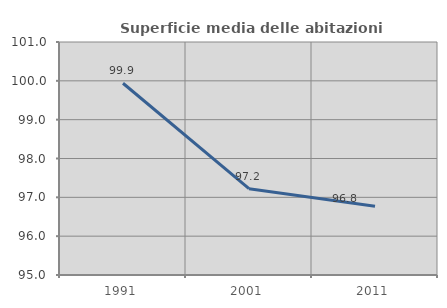
| Category | Superficie media delle abitazioni occupate |
|---|---|
| 1991.0 | 99.937 |
| 2001.0 | 97.224 |
| 2011.0 | 96.77 |